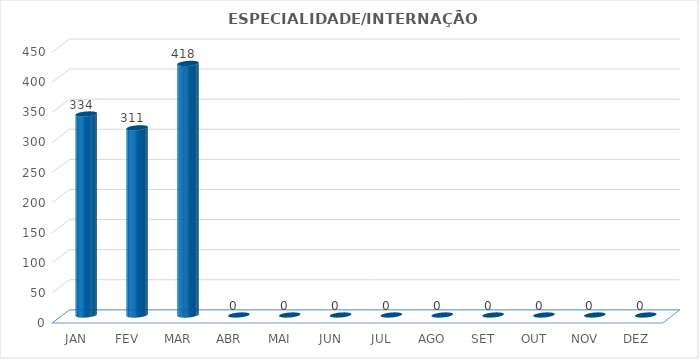
| Category | Series 0 |
|---|---|
| JAN | 334 |
| FEV | 311 |
| MAR | 418 |
| ABR | 0 |
| MAI | 0 |
| JUN | 0 |
| JUL | 0 |
| AGO | 0 |
| SET | 0 |
| OUT | 0 |
| NOV | 0 |
| DEZ | 0 |